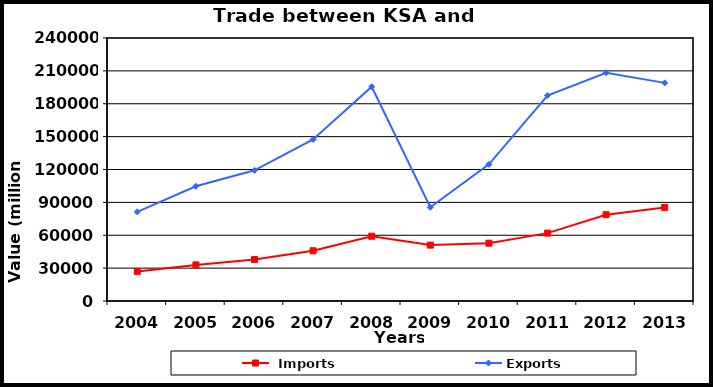
| Category |  Imports | Exports |
|---|---|---|
| 2004.0 | 27028 | 81360 |
| 2005.0 | 32952 | 104746 |
| 2006.0 | 37802 | 119239 |
| 2007.0 | 45852 | 147432 |
| 2008.0 | 59107 | 195521 |
| 2009.0 | 50999 | 85532 |
| 2010.0 | 52749 | 124675 |
| 2011.0 | 61943 | 187522 |
| 2012.0 | 78770 | 208339 |
| 2013.0 | 85376 | 199060 |